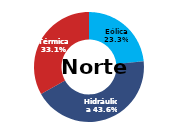
| Category | Norte |
|---|---|
| Eólica | 81.574 |
| Hidráulica | 152.488 |
| Solar | 0 |
| Térmica | 116.014 |